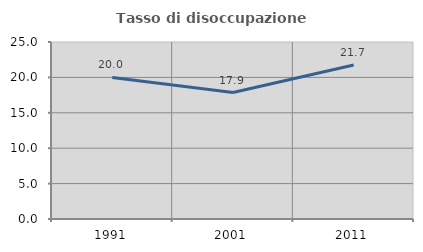
| Category | Tasso di disoccupazione giovanile  |
|---|---|
| 1991.0 | 20 |
| 2001.0 | 17.857 |
| 2011.0 | 21.739 |